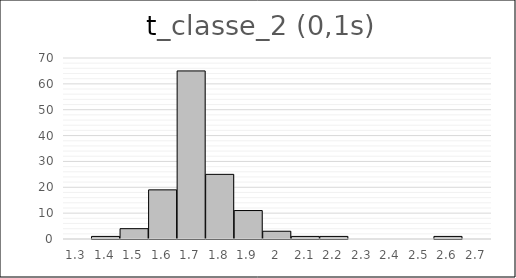
| Category | 1 4 19 65 25 11 3 1 1 0 0 0 1 0 |
|---|---|
| 1.3 | 0 |
| 1.4 | 1 |
| 1.5 | 4 |
| 1.6 | 19 |
| 1.7 | 65 |
| 1.8 | 25 |
| 1.9 | 11 |
| 2.0 | 3 |
| 2.1 | 1 |
| 2.2 | 1 |
| 2.3 | 0 |
| 2.4 | 0 |
| 2.5 | 0 |
| 2.6 | 1 |
| 2.7 | 0 |